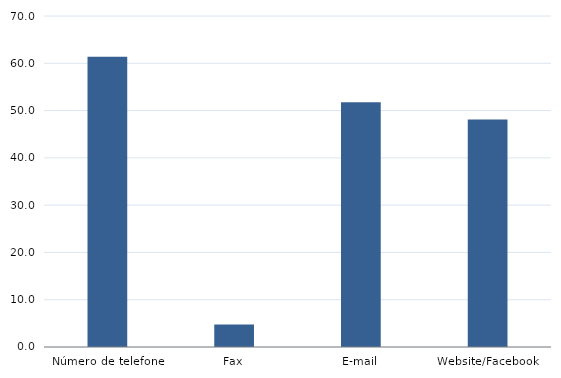
| Category | Percentagem |
|---|---|
| Número de telefone | 61.364 |
| Fax | 4.765 |
| E-mail | 51.76 |
| Website/Facebook | 48.094 |